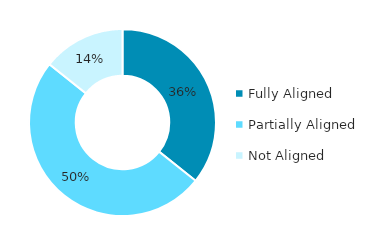
| Category | Series 0 |
|---|---|
| Fully Aligned | 0.357 |
| Partially Aligned | 0.5 |
| Not Aligned | 0.143 |